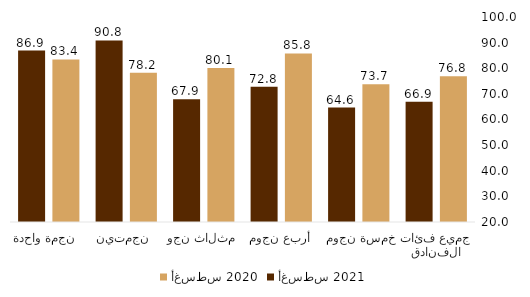
| Category | أغسطس 2020 | أغسطس 2021 |
|---|---|---|
| جميع فئات الفنادق | 76.84 | 66.924 |
|  خمسة نجوم  | 73.717 | 64.636 |
| أربع نجوم | 85.765 | 72.799 |
| ثلاث نجوم  | 80.109 | 67.933 |
| نجمتين  | 78.235 | 90.838 |
| نجمة واحدة  | 83.423 | 86.893 |